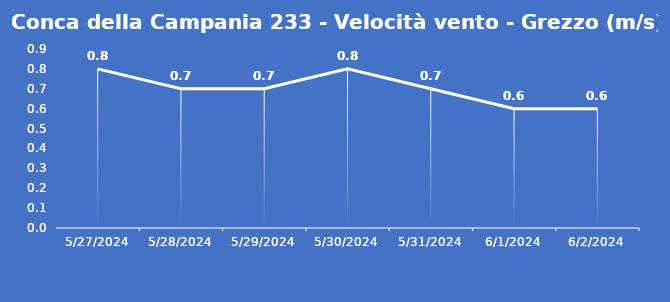
| Category | Conca della Campania 233 - Velocità vento - Grezzo (m/s) |
|---|---|
| 5/27/24 | 0.8 |
| 5/28/24 | 0.7 |
| 5/29/24 | 0.7 |
| 5/30/24 | 0.8 |
| 5/31/24 | 0.7 |
| 6/1/24 | 0.6 |
| 6/2/24 | 0.6 |